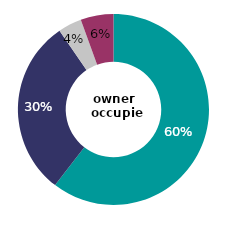
| Category | owner 
occupied |
|---|---|
| very satisfied | 60.472 |
| fairly satisfied | 29.967 |
| neither satisfied nor dissatisfied | 3.999 |
| all dissatisfied | 5.562 |